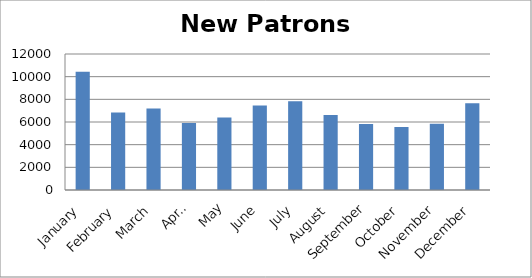
| Category | 10427 6836 7201 5906 6400 7456 7827 6619 5830 5560 5845 7655 |
|---|---|
| January | 10427 |
| February | 6836 |
| March | 7201 |
| April | 5906 |
| May | 6400 |
| June | 7456 |
| July | 7827 |
| August | 6619 |
| September | 5830 |
| October | 5560 |
| November | 5845 |
| December | 7655 |